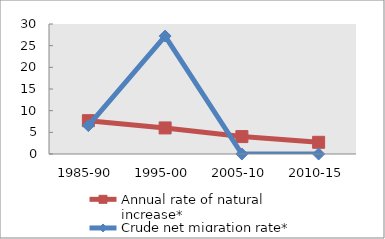
| Category | Annual rate of natural increase* | Crude net migration rate* |
|---|---|---|
| 1985-90 | 7.69 | 6.547 |
| 1995-00 | 6.015 | 27.218 |
| 2005-10 | 4.017 | 0 |
| 2010-15 | 2.7 | 0 |